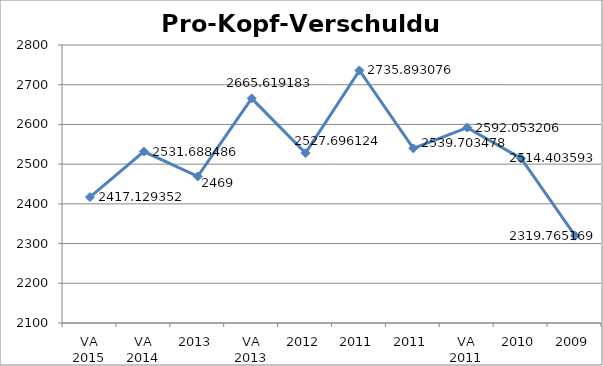
| Category | Pro-Kopf-Verschuldung |
|---|---|
| VA 2015 | 2417.129 |
| VA 2014 | 2531.688 |
| 2013 | 2469 |
| VA 2013 | 2665.619 |
| 2012 | 2527.696 |
| 2011 | 2735.893 |
| 2011 | 2539.703 |
| VA 2011 | 2592.053 |
| 2010 | 2514.404 |
| 2009 | 2319.765 |